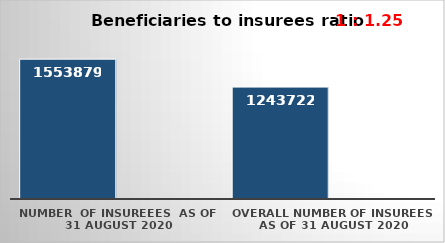
| Category | Series 0 | Series 1 |
|---|---|---|
| NUMBER  of insureees  as of  31 August 2020 | 1553879 |  |
| OVERALL number of insurees as of 31 August 2020 | 1243722 |  |